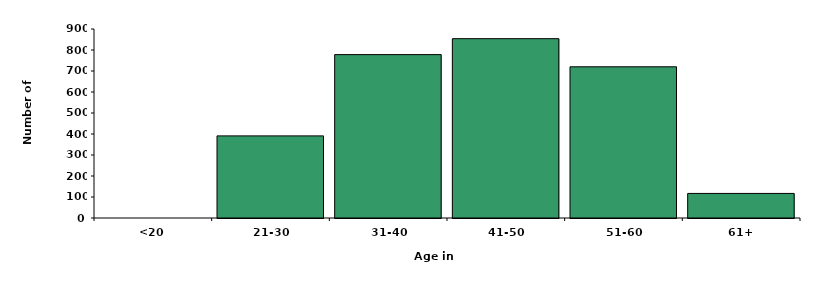
| Category | Series 0 |
|---|---|
| <20 | 0 |
| 21-30 | 391 |
| 31-40 | 778 |
| 41-50 | 854 |
| 51-60 | 720 |
| 61+ | 117 |